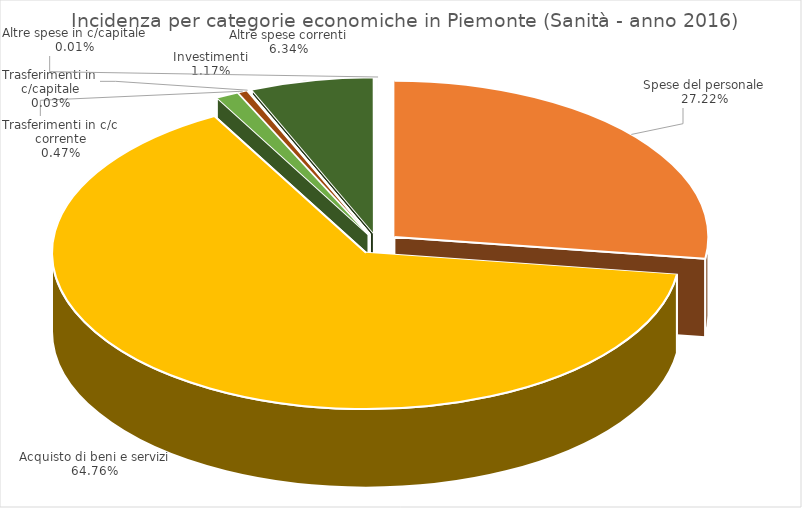
| Category | Series 0 |
|---|---|
| Spese del personale | 2222.23 |
| Acquisto di beni e servizi | 5285.91 |
| Investimenti | 95.61 |
| Trasferimenti in c/c corrente | 38.41 |
| Trasferimenti in c/capitale | 2.22 |
| Altre spese correnti | 517.643 |
| Altre spese in c/capitale | 0.86 |